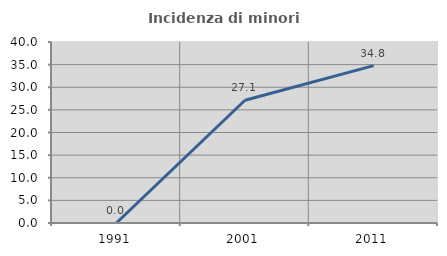
| Category | Incidenza di minori stranieri |
|---|---|
| 1991.0 | 0 |
| 2001.0 | 27.119 |
| 2011.0 | 34.783 |